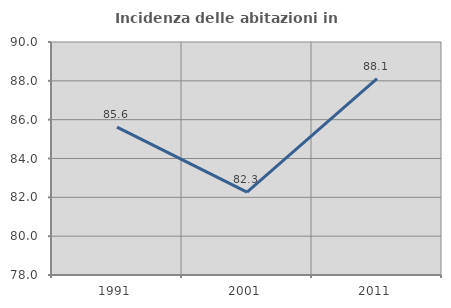
| Category | Incidenza delle abitazioni in proprietà  |
|---|---|
| 1991.0 | 85.612 |
| 2001.0 | 82.27 |
| 2011.0 | 88.112 |